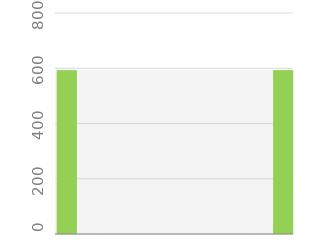
| Category | Series 2 |
|---|---|
| 0 | 592.5 |
| 1 | 592.5 |
| 2 | 592.5 |
| 3 | 592.5 |
| 4 | 592.5 |
| 5 | 592.5 |
| 6 | 592.5 |
| 7 | 592.5 |
| 8 | 592.5 |
| 9 | 592.5 |
| 10 | 592.5 |